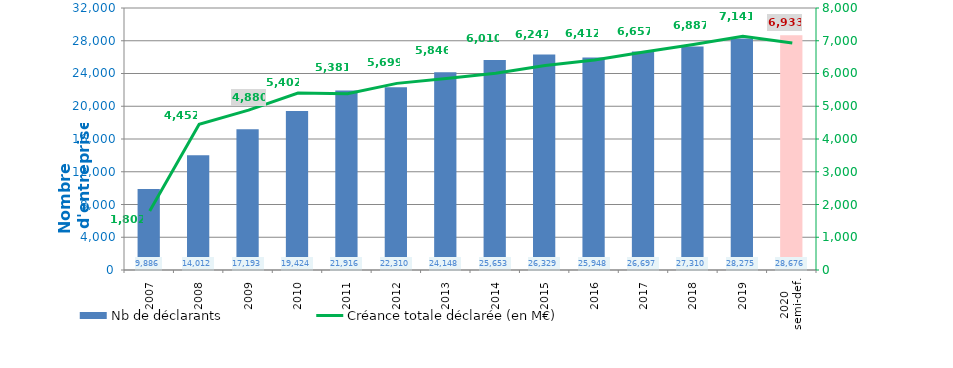
| Category | Nb de déclarants |
|---|---|
| 2007 | 9886 |
| 2008 | 14012 |
| 2009 | 17193 |
| 2010 | 19424 |
| 2011 | 21916 |
| 2012 | 22310 |
| 2013 | 24148 |
| 2014 | 25653 |
| 2015 | 26329 |
| 2016 | 25948 |
| 2017 | 26697 |
| 2018 | 27310 |
| 2019 | 28275 |
| 2020
semi-def. | 28676 |